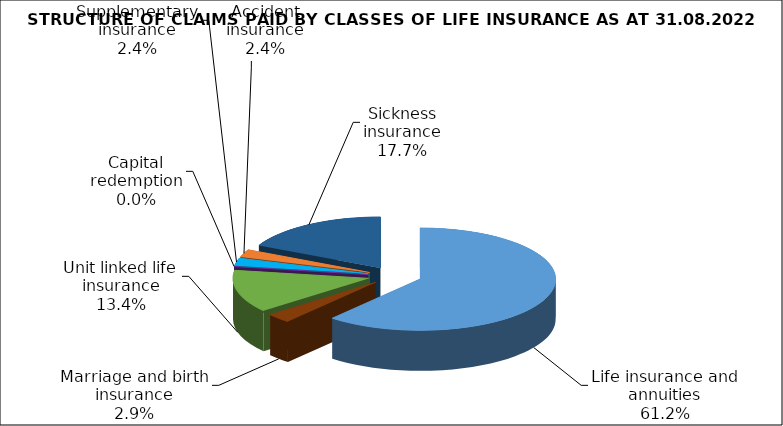
| Category | Series 0 |
|---|---|
| Life insurance and annuities | 105841365.403 |
| Marriage and birth insurance | 5090121.743 |
| Unit linked life insurance | 23207446.659 |
| Capital redemption | 0 |
| Supplementary insurance | 4184145.875 |
| Accident insurance | 4148868.421 |
| Sickness insurance | 30585121.908 |